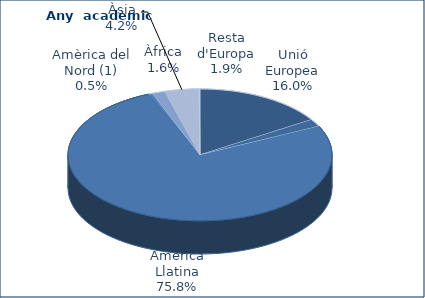
| Category | Series 0 |
|---|---|
| Unió Europea | 164 |
| Resta d'Europa | 19 |
| Amèrica Llatina | 776 |
| Amèrica del Nord (1) | 5 |
| Àfrica | 16 |
| Àsia | 43 |
| Oceania | 1 |